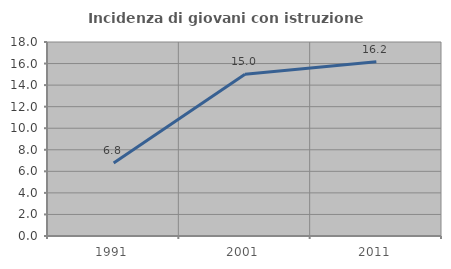
| Category | Incidenza di giovani con istruzione universitaria |
|---|---|
| 1991.0 | 6.78 |
| 2001.0 | 15 |
| 2011.0 | 16.176 |